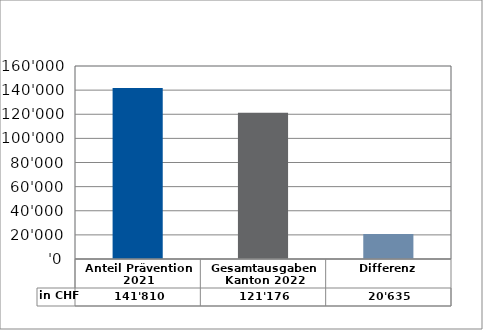
| Category | in CHF |
|---|---|
| Anteil Prävention 2021

 | 141810.25 |
| Gesamtausgaben Kanton 2022
 | 121175.7 |
| Differenz | 20634.55 |